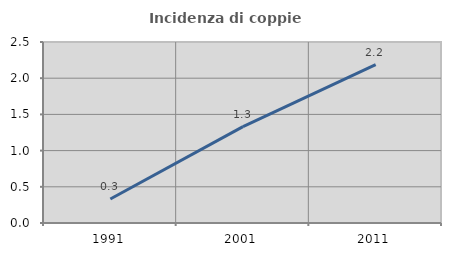
| Category | Incidenza di coppie miste |
|---|---|
| 1991.0 | 0.332 |
| 2001.0 | 1.331 |
| 2011.0 | 2.188 |